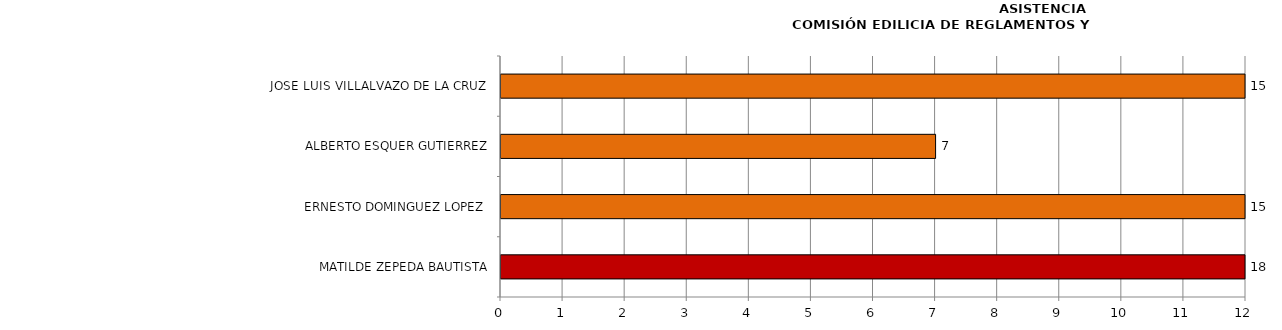
| Category | Series 0 |
|---|---|
| MATILDE ZEPEDA BAUTISTA | 18 |
| ERNESTO DOMINGUEZ LOPEZ  | 15 |
| ALBERTO ESQUER GUTIERREZ | 7 |
| JOSE LUIS VILLALVAZO DE LA CRUZ  | 15 |